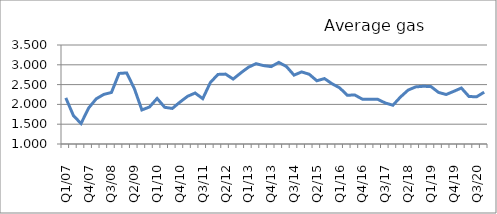
| Category | Series 0 |
|---|---|
| Q1/07  | 2.164 |
| Q2/07  | 1.718 |
| Q3/07  | 1.516 |
| Q4/07  | 1.908 |
| Q1/08  | 2.141 |
| Q2/08  | 2.253 |
| Q3/08  | 2.301 |
| Q4/08  | 2.782 |
| Q1/09  | 2.795 |
| Q2/09  | 2.405 |
| Q3/09  | 1.86 |
| Q4/09  | 1.935 |
| Q1/10  | 2.151 |
| Q2/10  | 1.927 |
| Q3/10  | 1.898 |
| Q4/10  | 2.057 |
| Q1/11  | 2.204 |
| Q2/11  | 2.288 |
| Q3/11  | 2.144 |
| Q4/11  | 2.552 |
| Q1/12  | 2.757 |
| Q2/12  | 2.765 |
| Q3/12  | 2.64 |
| Q4/12  | 2.794 |
| Q1/13  | 2.938 |
| Q2/13  | 3.028 |
| Q3/13  | 2.98 |
| Q4/13  | 2.954 |
| Q1/14  | 3.061 |
| Q2/14  | 2.957 |
| Q3/14  | 2.739 |
| Q4/14  | 2.82 |
| Q1/15  | 2.762 |
| Q2/15  | 2.597 |
| Q3/15  | 2.652 |
| Q4/15  | 2.522 |
| Q1/16  | 2.418 |
| Q2/16  | 2.232 |
| Q3/16  | 2.236 |
| Q4/16  | 2.13 |
| Q1/17  | 2.133 |
| Q2/17  | 2.128 |
| Q3/17  | 2.036 |
| Q4/17  | 1.979 |
| Q1/18  | 2.188 |
| Q2/18  | 2.362 |
| Q3/18  | 2.442 |
| Q4/18  | 2.458 |
| Q1/19  | 2.451 |
| Q2/19  | 2.302 |
| Q3/19  | 2.25 |
| Q4/19  | 2.33 |
| Q1/20  | 2.414 |
| Q2/20  | 2.199 |
| Q3/20  | 2.193 |
| Q4/20  | 2.309 |